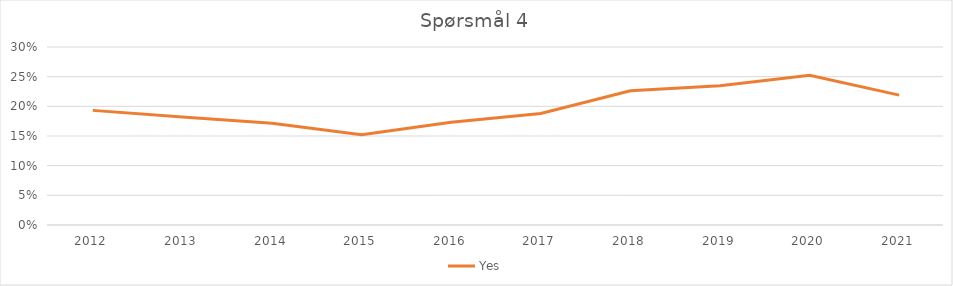
| Category | Yes |
|---|---|
| 2012.0 | 0.193 |
| 2013.0 | 0.182 |
| 2014.0 | 0.171 |
| 2015.0 | 0.152 |
| 2016.0 | 0.173 |
| 2017.0 | 0.188 |
| 2018.0 | 0.226 |
| 2019.0 | 0.235 |
| 2020.0 | 0.252 |
| 2021.0 | 0.219 |